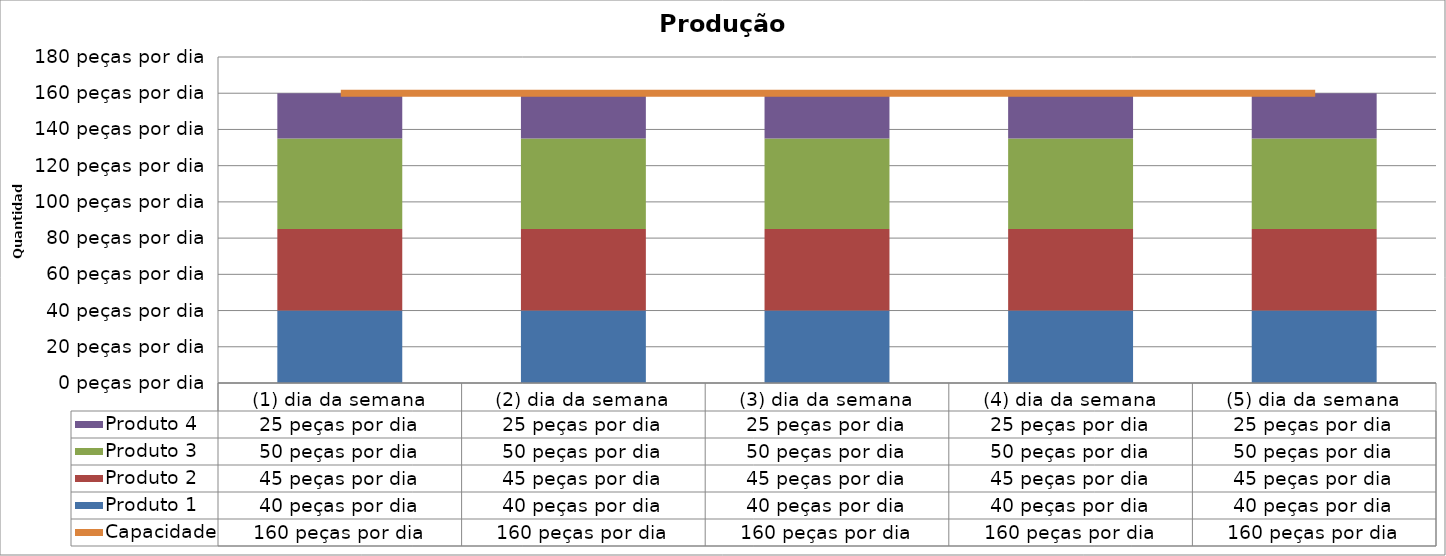
| Category | Produto 1 | Produto 2 | Produto 3 | Produto 4 |
|---|---|---|---|---|
| (1) dia da semana | 40 | 45 | 50 | 25 |
| (2) dia da semana | 40 | 45 | 50 | 25 |
| (3) dia da semana | 40 | 45 | 50 | 25 |
| (4) dia da semana | 40 | 45 | 50 | 25 |
| (5) dia da semana | 40 | 45 | 50 | 25 |